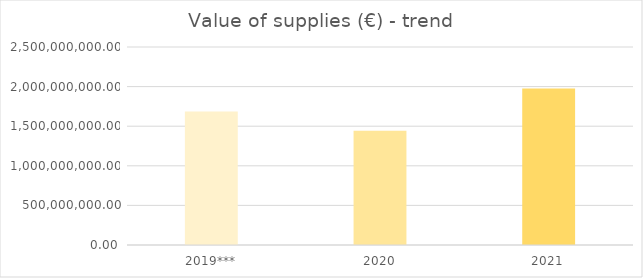
| Category | Series 0 |
|---|---|
| 2019*** | 1686695159 |
| 2020 | 1441404805 |
| 2021 | 1977077738 |